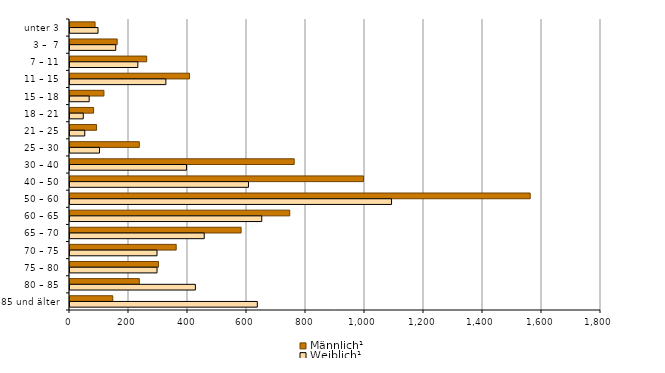
| Category | Männlich¹ | Weiblich¹ |
|---|---|---|
| unter 3 | 85 | 95 |
|   3 –  7 | 160 | 155 |
|   7 – 11 | 260 | 230 |
| 11 – 15 | 405 | 325 |
| 15 – 18 | 115 | 65 |
| 18 – 21 | 80 | 45 |
| 21 – 25 | 90 | 50 |
| 25 – 30 | 235 | 100 |
| 30 – 40 | 760 | 395 |
| 40 – 50 | 995 | 605 |
| 50 – 60 | 1560 | 1090 |
| 60 – 65 | 745 | 650 |
| 65 – 70 | 580 | 455 |
| 70 – 75 | 360 | 295 |
| 75 – 80 | 300 | 295 |
| 80 – 85 | 235 | 425 |
| 85 und älter | 145 | 635 |